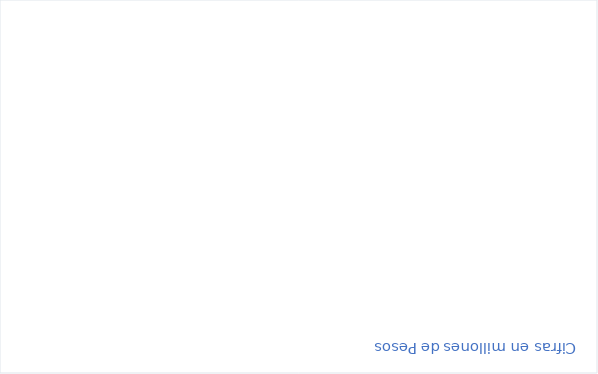
| Category | RESERVAS CONSTITUIDAS
 | CANCELACIONES RESERVAS PRESUPUESTALES
  | PAGOS
ACUMULADOS
 |
|---|---|---|---|
| Total | 55446.915 | 0 | 38248.131 |